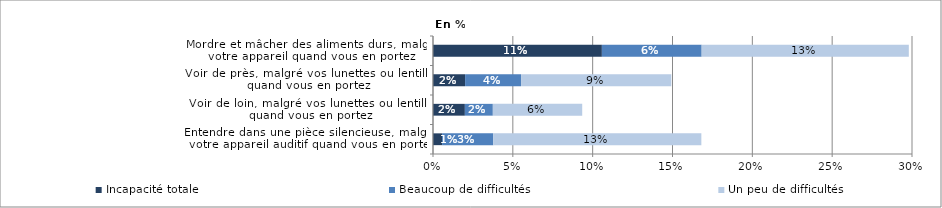
| Category | Incapacité totale | Beaucoup de difficultés | Un peu de difficultés |
|---|---|---|---|
| Entendre dans une pièce silencieuse, malgré votre appareil auditif quand vous en portez | 0.006 | 0.032 | 0.13 |
| Voir de loin, malgré vos lunettes ou lentilles quand vous en portez | 0.02 | 0.018 | 0.056 |
| Voir de près, malgré vos lunettes ou lentilles quand vous en portez | 0.02 | 0.035 | 0.094 |
| Mordre et mâcher des aliments durs, malgré votre appareil quand vous en portez | 0.106 | 0.062 | 0.13 |